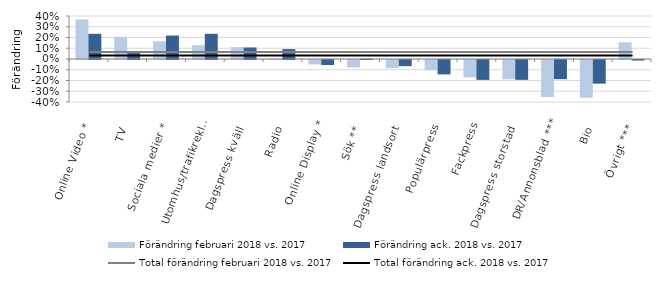
| Category | Förändring februari 2018 vs. 2017 | Förändring ack. 2018 vs. 2017 |
|---|---|---|
| Online Video * | 0.368 | 0.234 |
| TV | 0.205 | 0.055 |
| Sociala medier * | 0.164 | 0.218 |
| Utomhus/trafikreklam | 0.128 | 0.234 |
| Dagspress kväll  | 0.11 | 0.107 |
| Radio | 0.005 | 0.092 |
| Online Display * | -0.041 | -0.047 |
| Sök ** | -0.069 | 0.004 |
| Dagspress landsort  | -0.076 | -0.057 |
| Populärpress | -0.095 | -0.134 |
| Fackpress | -0.162 | -0.185 |
| Dagspress storstad  | -0.179 | -0.185 |
| DR/Annonsblad *** | -0.344 | -0.178 |
| Bio | -0.351 | -0.22 |
| Övrigt *** | 0.156 | -0.005 |